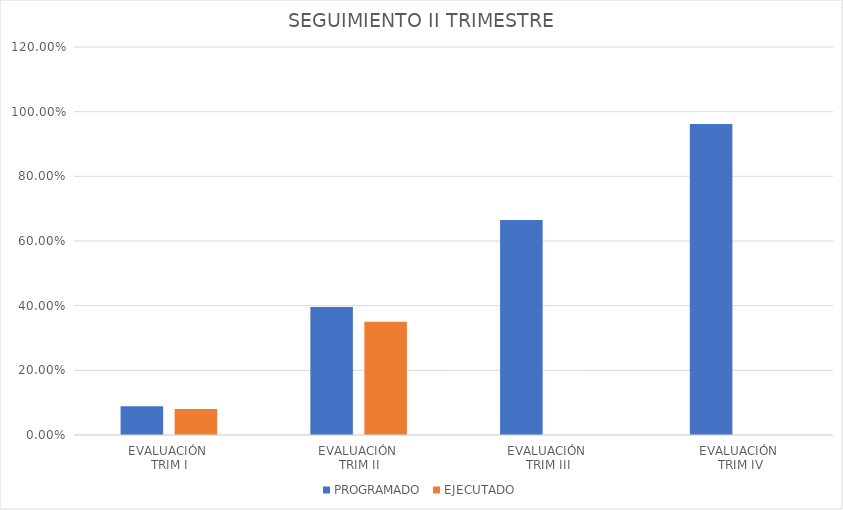
| Category | PROGRAMADO | EJECUTADO |
|---|---|---|
| EVALUACIÓN 
TRIM I | 0.089 | 0.08 |
| EVALUACIÓN 
TRIM II | 0.396 | 0.35 |
| EVALUACIÓN 
TRIM III | 0.665 | 0 |
| EVALUACIÓN
 TRIM IV | 0.962 | 0 |